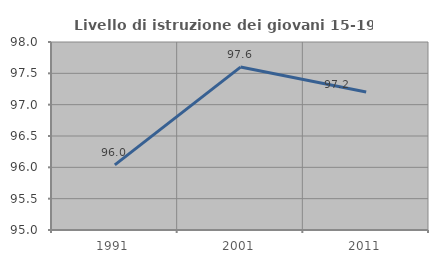
| Category | Livello di istruzione dei giovani 15-19 anni |
|---|---|
| 1991.0 | 96.04 |
| 2001.0 | 97.6 |
| 2011.0 | 97.203 |